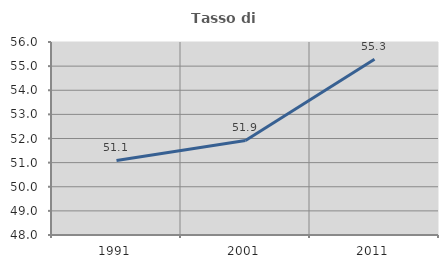
| Category | Tasso di occupazione   |
|---|---|
| 1991.0 | 51.092 |
| 2001.0 | 51.919 |
| 2011.0 | 55.285 |